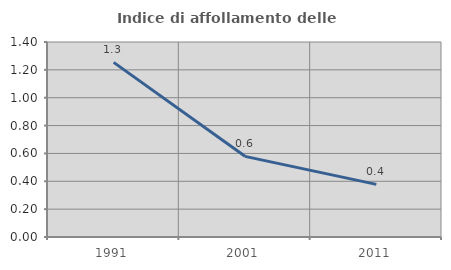
| Category | Indice di affollamento delle abitazioni  |
|---|---|
| 1991.0 | 1.254 |
| 2001.0 | 0.579 |
| 2011.0 | 0.378 |